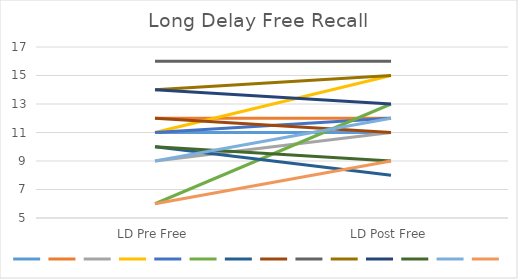
| Category | Series 0 | Series 1 | Series 2 | Series 3 | Series 4 | Series 5 | Series 6 | Series 7 | Series 8 | Series 9 | Series 10 | Series 11 | Series 12 | Series 13 |
|---|---|---|---|---|---|---|---|---|---|---|---|---|---|---|
| LD Pre Free | 11 | 12 | 9 | 11 | 11 | 6 | 10 | 12 | 16 | 14 | 14 | 10 | 9 | 6 |
| LD Post Free | 11 | 12 | 11 | 15 | 12 | 13 | 8 | 11 | 16 | 15 | 13 | 9 | 12 | 9 |